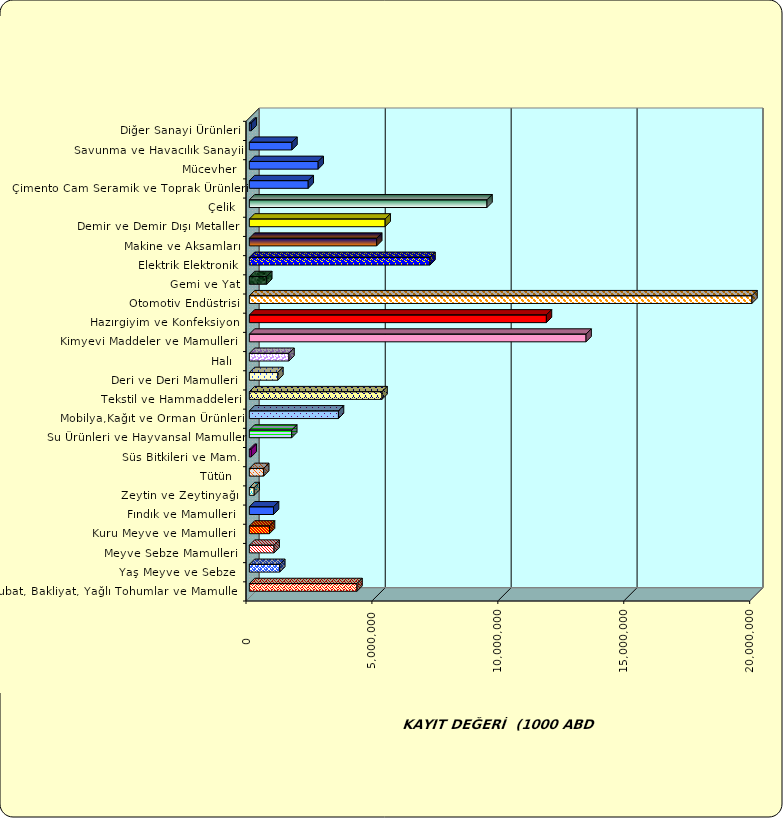
| Category | Series 0 |
|---|---|
|  Hububat, Bakliyat, Yağlı Tohumlar ve Mamulleri  | 4274778.941 |
|  Yaş Meyve ve Sebze   | 1207256.285 |
|  Meyve Sebze Mamulleri  | 981305.869 |
|  Kuru Meyve ve Mamulleri   | 799761.626 |
|  Fındık ve Mamulleri  | 959201.897 |
|  Zeytin ve Zeytinyağı  | 192066.797 |
|  Tütün  | 569256.49 |
|  Süs Bitkileri ve Mam. | 74920.616 |
|  Su Ürünleri ve Hayvansal Mamuller | 1682294.77 |
|  Mobilya,Kağıt ve Orman Ürünleri | 3538290.614 |
|  Tekstil ve Hammaddeleri | 5267378.022 |
|  Deri ve Deri Mamulleri  | 1132594.275 |
|  Halı  | 1573482.673 |
|  Kimyevi Maddeler ve Mamulleri   | 13370081.219 |
|  Hazırgiyim ve Konfeksiyon  | 11795578.434 |
|  Otomotiv Endüstrisi | 19957566.304 |
|  Gemi ve Yat | 689646.395 |
|  Elektrik Elektronik | 7173618.033 |
|  Makine ve Aksamları | 5057456.591 |
|  Demir ve Demir Dışı Metaller  | 5392187.82 |
|  Çelik | 9436209.213 |
|  Çimento Cam Seramik ve Toprak Ürünleri | 2337539.63 |
|  Mücevher | 2732682.186 |
|  Savunma ve Havacılık Sanayii | 1691519.714 |
|  Diğer Sanayi Ürünleri | 76432.379 |